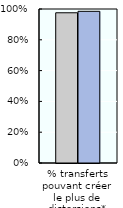
| Category | 2000-02 | 2018-20 |
|---|---|---|
| % transferts pouvant créer le plus de distorsions* | 0.975 | 0.985 |